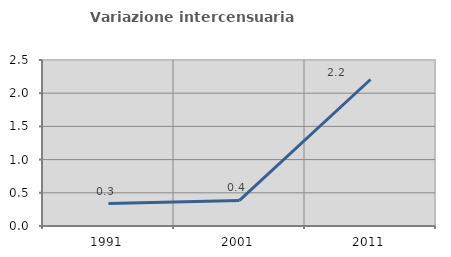
| Category | Variazione intercensuaria annua |
|---|---|
| 1991.0 | 0.337 |
| 2001.0 | 0.385 |
| 2011.0 | 2.206 |